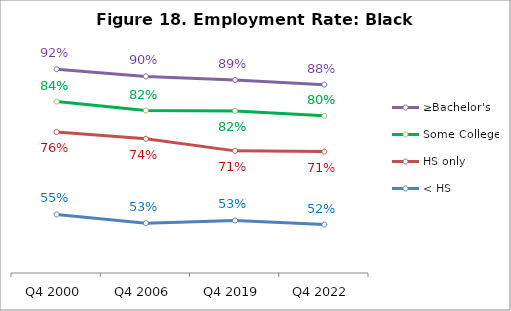
| Category | ≥Bachelor's | Some College | HS only | < HS |
|---|---|---|---|---|
| Q4 2000 | 0.923 | 0.84 | 0.762 | 0.55 |
| Q4 2006 | 0.904 | 0.817 | 0.744 | 0.528 |
| Q4 2019 | 0.895 | 0.816 | 0.713 | 0.535 |
| Q4 2022 | 0.883 | 0.803 | 0.711 | 0.524 |